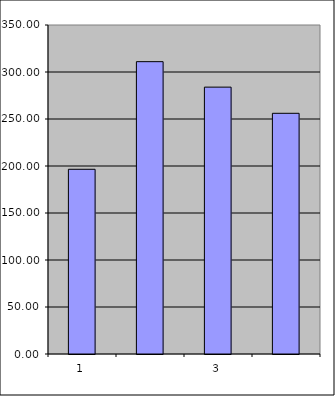
| Category | Series 0 |
|---|---|
| 0 | 196.5 |
| 1 | 310.999 |
| 2 | 283.903 |
| 3 | 256.062 |